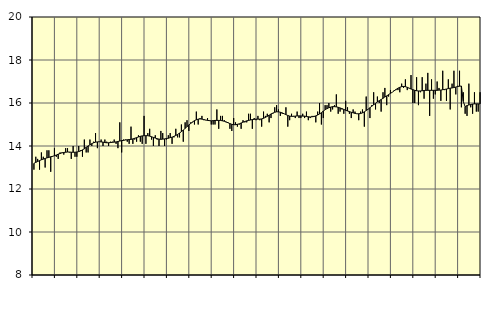
| Category | Vård och omsorg, SNI 86-88 | Series 1 |
|---|---|---|
| nan | 12.9 | 13.19 |
| 1.0 | 13.5 | 13.24 |
| 1.0 | 13.4 | 13.28 |
| 1.0 | 12.9 | 13.32 |
| 1.0 | 13.7 | 13.36 |
| 1.0 | 13.5 | 13.39 |
| 1.0 | 13 | 13.42 |
| 1.0 | 13.8 | 13.45 |
| 1.0 | 13.8 | 13.47 |
| 1.0 | 12.8 | 13.5 |
| 1.0 | 13.5 | 13.52 |
| 1.0 | 13.9 | 13.55 |
| nan | 13.5 | 13.58 |
| 2.0 | 13.4 | 13.62 |
| 2.0 | 13.7 | 13.65 |
| 2.0 | 13.7 | 13.68 |
| 2.0 | 13.6 | 13.7 |
| 2.0 | 13.9 | 13.71 |
| 2.0 | 13.9 | 13.72 |
| 2.0 | 13.7 | 13.72 |
| 2.0 | 13.4 | 13.71 |
| 2.0 | 14 | 13.71 |
| 2.0 | 13.5 | 13.71 |
| 2.0 | 13.5 | 13.72 |
| nan | 14 | 13.74 |
| 3.0 | 13.8 | 13.77 |
| 3.0 | 13.5 | 13.82 |
| 3.0 | 14.3 | 13.87 |
| 3.0 | 13.7 | 13.94 |
| 3.0 | 13.7 | 14 |
| 3.0 | 14.3 | 14.06 |
| 3.0 | 14 | 14.11 |
| 3.0 | 14.2 | 14.15 |
| 3.0 | 14.6 | 14.18 |
| 3.0 | 13.9 | 14.19 |
| 3.0 | 14.2 | 14.2 |
| nan | 14.3 | 14.19 |
| 4.0 | 14 | 14.18 |
| 4.0 | 14.3 | 14.16 |
| 4.0 | 14.2 | 14.15 |
| 4.0 | 14 | 14.15 |
| 4.0 | 14.2 | 14.16 |
| 4.0 | 14.2 | 14.17 |
| 4.0 | 14.3 | 14.18 |
| 4.0 | 14.1 | 14.19 |
| 4.0 | 13.9 | 14.21 |
| 4.0 | 15.1 | 14.23 |
| 4.0 | 13.7 | 14.25 |
| nan | 14.3 | 14.26 |
| 5.0 | 14.3 | 14.28 |
| 5.0 | 14.2 | 14.29 |
| 5.0 | 14.1 | 14.3 |
| 5.0 | 14.9 | 14.31 |
| 5.0 | 14.1 | 14.33 |
| 5.0 | 14.3 | 14.36 |
| 5.0 | 14.2 | 14.39 |
| 5.0 | 14.5 | 14.42 |
| 5.0 | 14.2 | 14.45 |
| 5.0 | 14.1 | 14.47 |
| 5.0 | 15.4 | 14.48 |
| nan | 14.1 | 14.48 |
| 6.0 | 14.6 | 14.48 |
| 6.0 | 14.8 | 14.46 |
| 6.0 | 14.3 | 14.43 |
| 6.0 | 14 | 14.4 |
| 6.0 | 14.5 | 14.37 |
| 6.0 | 14.3 | 14.34 |
| 6.0 | 14 | 14.32 |
| 6.0 | 14.7 | 14.31 |
| 6.0 | 14.6 | 14.32 |
| 6.0 | 14 | 14.33 |
| 6.0 | 14.3 | 14.35 |
| nan | 14.5 | 14.36 |
| 7.0 | 14.6 | 14.39 |
| 7.0 | 14.1 | 14.41 |
| 7.0 | 14.4 | 14.45 |
| 7.0 | 14.8 | 14.49 |
| 7.0 | 14.4 | 14.54 |
| 7.0 | 14.4 | 14.6 |
| 7.0 | 15 | 14.67 |
| 7.0 | 14.2 | 14.74 |
| 7.0 | 15.1 | 14.82 |
| 7.0 | 15.2 | 14.9 |
| 7.0 | 14.7 | 14.98 |
| nan | 15.1 | 15.05 |
| 8.0 | 15.1 | 15.12 |
| 8.0 | 15 | 15.18 |
| 8.0 | 15.6 | 15.22 |
| 8.0 | 15 | 15.25 |
| 8.0 | 15.3 | 15.26 |
| 8.0 | 15.4 | 15.25 |
| 8.0 | 15.2 | 15.23 |
| 8.0 | 15.2 | 15.21 |
| 8.0 | 15.3 | 15.19 |
| 8.0 | 15.2 | 15.18 |
| 8.0 | 15 | 15.17 |
| nan | 15 | 15.18 |
| 9.0 | 15 | 15.19 |
| 9.0 | 15.7 | 15.19 |
| 9.0 | 14.8 | 15.19 |
| 9.0 | 15.4 | 15.19 |
| 9.0 | 15.4 | 15.17 |
| 9.0 | 15.2 | 15.15 |
| 9.0 | 15.1 | 15.12 |
| 9.0 | 15.1 | 15.08 |
| 9.0 | 14.8 | 15.04 |
| 9.0 | 14.7 | 15.01 |
| 9.0 | 15.3 | 14.99 |
| nan | 15.1 | 14.99 |
| 10.0 | 14.9 | 15.01 |
| 10.0 | 15 | 15.03 |
| 10.0 | 14.8 | 15.07 |
| 10.0 | 15.2 | 15.11 |
| 10.0 | 15.1 | 15.14 |
| 10.0 | 15.1 | 15.17 |
| 10.0 | 15.5 | 15.19 |
| 10.0 | 15.5 | 15.21 |
| 10.0 | 14.8 | 15.23 |
| 10.0 | 15.3 | 15.24 |
| 10.0 | 15.2 | 15.25 |
| nan | 15.4 | 15.25 |
| 11.0 | 15.2 | 15.25 |
| 11.0 | 14.9 | 15.26 |
| 11.0 | 15.6 | 15.29 |
| 11.0 | 15.4 | 15.33 |
| 11.0 | 15.5 | 15.38 |
| 11.0 | 15.1 | 15.43 |
| 11.0 | 15.3 | 15.49 |
| 11.0 | 15.5 | 15.53 |
| 11.0 | 15.8 | 15.57 |
| 11.0 | 15.9 | 15.59 |
| 11.0 | 15.7 | 15.59 |
| nan | 15.4 | 15.57 |
| 12.0 | 15.5 | 15.54 |
| 12.0 | 15.5 | 15.5 |
| 12.0 | 15.8 | 15.46 |
| 12.0 | 14.9 | 15.42 |
| 12.0 | 15.2 | 15.39 |
| 12.0 | 15.5 | 15.38 |
| 12.0 | 15.4 | 15.38 |
| 12.0 | 15.3 | 15.39 |
| 12.0 | 15.6 | 15.4 |
| 12.0 | 15.3 | 15.4 |
| 12.0 | 15.3 | 15.4 |
| nan | 15.5 | 15.39 |
| 13.0 | 15.3 | 15.39 |
| 13.0 | 15.6 | 15.37 |
| 13.0 | 15.2 | 15.36 |
| 13.0 | 15.3 | 15.35 |
| 13.0 | 15.4 | 15.36 |
| 13.0 | 15.4 | 15.37 |
| 13.0 | 15.1 | 15.4 |
| 13.0 | 15.6 | 15.44 |
| 13.0 | 16 | 15.49 |
| 13.0 | 15 | 15.55 |
| 13.0 | 15.3 | 15.62 |
| nan | 15.9 | 15.69 |
| 14.0 | 15.9 | 15.74 |
| 14.0 | 16 | 15.78 |
| 14.0 | 15.6 | 15.81 |
| 14.0 | 15.7 | 15.83 |
| 14.0 | 15.9 | 15.83 |
| 14.0 | 16.4 | 15.82 |
| 14.0 | 15.5 | 15.8 |
| 14.0 | 15.6 | 15.77 |
| 14.0 | 15.7 | 15.74 |
| 14.0 | 15.5 | 15.7 |
| 14.0 | 16.1 | 15.66 |
| nan | 15.8 | 15.63 |
| 15.0 | 15.5 | 15.6 |
| 15.0 | 15.3 | 15.57 |
| 15.0 | 15.7 | 15.54 |
| 15.0 | 15.6 | 15.52 |
| 15.0 | 15.5 | 15.5 |
| 15.0 | 15.2 | 15.5 |
| 15.0 | 15.6 | 15.51 |
| 15.0 | 15.7 | 15.54 |
| 15.0 | 14.9 | 15.59 |
| 15.0 | 16.3 | 15.65 |
| 15.0 | 15.7 | 15.71 |
| nan | 15.3 | 15.78 |
| 16.0 | 15.9 | 15.85 |
| 16.0 | 16.5 | 15.92 |
| 16.0 | 15.7 | 15.98 |
| 16.0 | 16.3 | 16.05 |
| 16.0 | 16 | 16.11 |
| 16.0 | 15.6 | 16.16 |
| 16.0 | 16.5 | 16.22 |
| 16.0 | 16.7 | 16.28 |
| 16.0 | 15.9 | 16.33 |
| 16.0 | 16.3 | 16.39 |
| 16.0 | 16.6 | 16.45 |
| nan | 16.5 | 16.5 |
| 17.0 | 16.6 | 16.57 |
| 17.0 | 16.6 | 16.63 |
| 17.0 | 16.6 | 16.69 |
| 17.0 | 16.5 | 16.73 |
| 17.0 | 16.9 | 16.76 |
| 17.0 | 16.7 | 16.77 |
| 17.0 | 17.1 | 16.76 |
| 17.0 | 16.6 | 16.73 |
| 17.0 | 16.7 | 16.69 |
| 17.0 | 17.3 | 16.65 |
| 17.0 | 16 | 16.62 |
| nan | 16 | 16.59 |
| 18.0 | 17.2 | 16.57 |
| 18.0 | 15.9 | 16.56 |
| 18.0 | 16.5 | 16.56 |
| 18.0 | 17.2 | 16.57 |
| 18.0 | 16.2 | 16.58 |
| 18.0 | 16.9 | 16.59 |
| 18.0 | 17.4 | 16.59 |
| 18.0 | 15.4 | 16.59 |
| 18.0 | 17.1 | 16.59 |
| 18.0 | 16.2 | 16.59 |
| 18.0 | 16.4 | 16.59 |
| nan | 17 | 16.59 |
| 19.0 | 16.7 | 16.6 |
| 19.0 | 16.1 | 16.6 |
| 19.0 | 17.5 | 16.62 |
| 19.0 | 16.6 | 16.63 |
| 19.0 | 16.1 | 16.65 |
| 19.0 | 17.1 | 16.67 |
| 19.0 | 15.7 | 16.69 |
| 19.0 | 16.9 | 16.7 |
| 19.0 | 17.5 | 16.72 |
| 19.0 | 16.4 | 16.74 |
| 19.0 | 16.8 | 16.77 |
| nan | 17.5 | 16.78 |
| 20.0 | 15.8 | 16.79 |
| 20.0 | 16.5 | 16.07 |
| 20.0 | 15.5 | 15.83 |
| 20.0 | 15.4 | 15.88 |
| 20.0 | 16.9 | 15.91 |
| 20.0 | 15.8 | 15.93 |
| 20.0 | 15.5 | 15.95 |
| 20.0 | 16.5 | 15.96 |
| 20.0 | 15.6 | 15.96 |
| 20.0 | 15.6 | 15.96 |
| 20.0 | 16.5 | 15.96 |